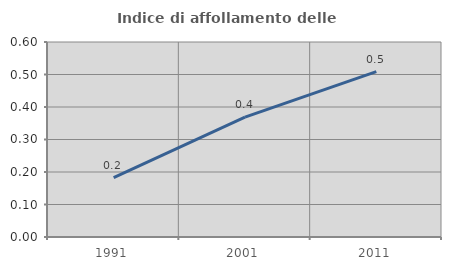
| Category | Indice di affollamento delle abitazioni  |
|---|---|
| 1991.0 | 0.183 |
| 2001.0 | 0.369 |
| 2011.0 | 0.509 |